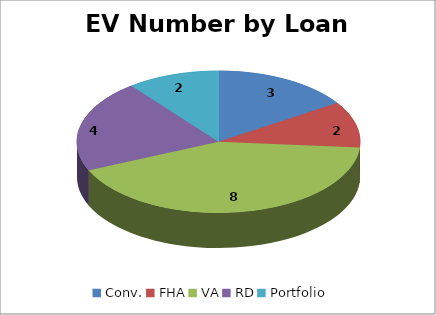
| Category | EV Number |
|---|---|
| Conv. | 3 |
| FHA | 2 |
| VA | 8 |
| RD | 4 |
| Portfolio | 2 |